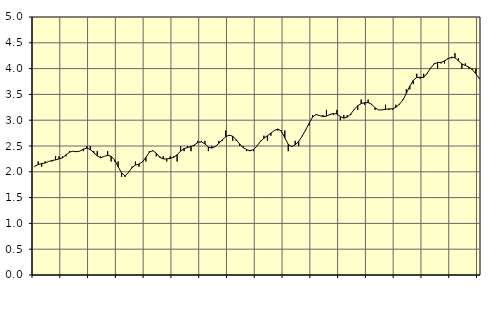
| Category | Piggar | Series 1 |
|---|---|---|
| nan | 2.1 | 2.11 |
| 87.0 | 2.2 | 2.14 |
| 87.0 | 2.1 | 2.16 |
| 87.0 | 2.2 | 2.17 |
| nan | 2.2 | 2.2 |
| 88.0 | 2.2 | 2.22 |
| 88.0 | 2.3 | 2.23 |
| 88.0 | 2.3 | 2.25 |
| nan | 2.3 | 2.27 |
| 89.0 | 2.3 | 2.33 |
| 89.0 | 2.4 | 2.38 |
| 89.0 | 2.4 | 2.4 |
| nan | 2.4 | 2.39 |
| 90.0 | 2.4 | 2.4 |
| 90.0 | 2.4 | 2.44 |
| 90.0 | 2.5 | 2.46 |
| nan | 2.5 | 2.43 |
| 91.0 | 2.4 | 2.37 |
| 91.0 | 2.4 | 2.31 |
| 91.0 | 2.3 | 2.27 |
| nan | 2.3 | 2.3 |
| 92.0 | 2.4 | 2.32 |
| 92.0 | 2.2 | 2.3 |
| 92.0 | 2.2 | 2.23 |
| nan | 2.2 | 2.1 |
| 93.0 | 1.9 | 1.98 |
| 93.0 | 1.9 | 1.92 |
| 93.0 | 2 | 1.99 |
| nan | 2.1 | 2.08 |
| 94.0 | 2.2 | 2.13 |
| 94.0 | 2.1 | 2.15 |
| 94.0 | 2.2 | 2.19 |
| nan | 2.2 | 2.28 |
| 95.0 | 2.4 | 2.38 |
| 95.0 | 2.4 | 2.41 |
| 95.0 | 2.3 | 2.36 |
| nan | 2.3 | 2.28 |
| 96.0 | 2.3 | 2.25 |
| 96.0 | 2.2 | 2.25 |
| 96.0 | 2.3 | 2.26 |
| nan | 2.3 | 2.28 |
| 97.0 | 2.2 | 2.33 |
| 97.0 | 2.5 | 2.4 |
| 97.0 | 2.4 | 2.45 |
| nan | 2.5 | 2.47 |
| 98.0 | 2.4 | 2.49 |
| 98.0 | 2.5 | 2.52 |
| 98.0 | 2.6 | 2.57 |
| nan | 2.6 | 2.58 |
| 99.0 | 2.6 | 2.54 |
| 99.0 | 2.4 | 2.48 |
| 99.0 | 2.5 | 2.46 |
| nan | 2.5 | 2.49 |
| 0.0 | 2.6 | 2.55 |
| 0.0 | 2.6 | 2.62 |
| 0.0 | 2.8 | 2.68 |
| nan | 2.7 | 2.71 |
| 1.0 | 2.6 | 2.69 |
| 1.0 | 2.6 | 2.62 |
| 1.0 | 2.5 | 2.54 |
| nan | 2.5 | 2.47 |
| 2.0 | 2.4 | 2.43 |
| 2.0 | 2.4 | 2.41 |
| 2.0 | 2.4 | 2.43 |
| nan | 2.5 | 2.5 |
| 3.0 | 2.6 | 2.59 |
| 3.0 | 2.7 | 2.65 |
| 3.0 | 2.6 | 2.7 |
| nan | 2.7 | 2.75 |
| 4.0 | 2.8 | 2.8 |
| 4.0 | 2.8 | 2.83 |
| 4.0 | 2.8 | 2.79 |
| nan | 2.8 | 2.66 |
| 5.0 | 2.4 | 2.53 |
| 5.0 | 2.5 | 2.49 |
| 5.0 | 2.6 | 2.52 |
| nan | 2.5 | 2.59 |
| 6.0 | 2.7 | 2.69 |
| 6.0 | 2.8 | 2.81 |
| 6.0 | 2.9 | 2.94 |
| nan | 3.1 | 3.06 |
| 7.0 | 3.1 | 3.11 |
| 7.0 | 3.1 | 3.09 |
| 7.0 | 3.1 | 3.07 |
| nan | 3.2 | 3.08 |
| 8.0 | 3.1 | 3.11 |
| 8.0 | 3.1 | 3.13 |
| 8.0 | 3.2 | 3.12 |
| nan | 3 | 3.07 |
| 9.0 | 3.1 | 3.04 |
| 9.0 | 3.1 | 3.06 |
| 9.0 | 3.1 | 3.12 |
| nan | 3.2 | 3.21 |
| 10.0 | 3.2 | 3.28 |
| 10.0 | 3.4 | 3.32 |
| 10.0 | 3.3 | 3.34 |
| nan | 3.4 | 3.34 |
| 11.0 | 3.3 | 3.31 |
| 11.0 | 3.2 | 3.24 |
| 11.0 | 3.2 | 3.2 |
| nan | 3.2 | 3.2 |
| 12.0 | 3.3 | 3.21 |
| 12.0 | 3.2 | 3.22 |
| 12.0 | 3.2 | 3.22 |
| nan | 3.3 | 3.25 |
| 13.0 | 3.3 | 3.31 |
| 13.0 | 3.4 | 3.39 |
| 13.0 | 3.6 | 3.52 |
| nan | 3.6 | 3.66 |
| 14.0 | 3.7 | 3.77 |
| 14.0 | 3.9 | 3.83 |
| 14.0 | 3.8 | 3.83 |
| nan | 3.9 | 3.83 |
| 15.0 | 3.9 | 3.91 |
| 15.0 | 4 | 4.01 |
| 15.0 | 4.1 | 4.09 |
| nan | 4 | 4.12 |
| 16.0 | 4.1 | 4.12 |
| 16.0 | 4.1 | 4.15 |
| 16.0 | 4.2 | 4.19 |
| nan | 4.2 | 4.22 |
| 17.0 | 4.3 | 4.21 |
| 17.0 | 4.2 | 4.15 |
| 17.0 | 4 | 4.09 |
| nan | 4.1 | 4.06 |
| 18.0 | 4 | 4.03 |
| 18.0 | 4 | 3.98 |
| 18.0 | 4 | 3.9 |
| nan | 3.8 | 3.81 |